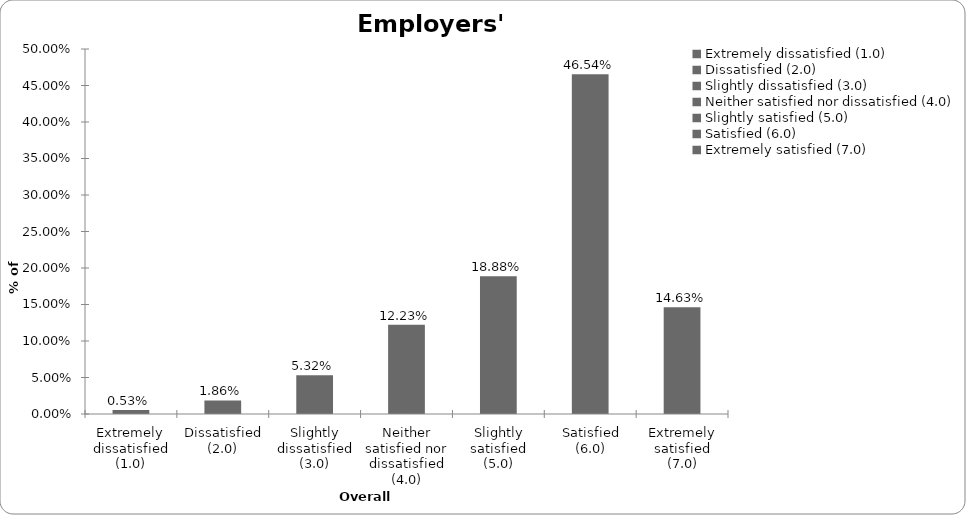
| Category | Series 0 |
|---|---|
| Extremely dissatisfied (1.0) | 0.005 |
| Dissatisfied (2.0) | 0.019 |
| Slightly dissatisfied (3.0) | 0.053 |
| Neither satisfied nor dissatisfied (4.0) | 0.122 |
| Slightly satisfied (5.0) | 0.189 |
| Satisfied (6.0) | 0.465 |
| Extremely satisfied (7.0) | 0.146 |